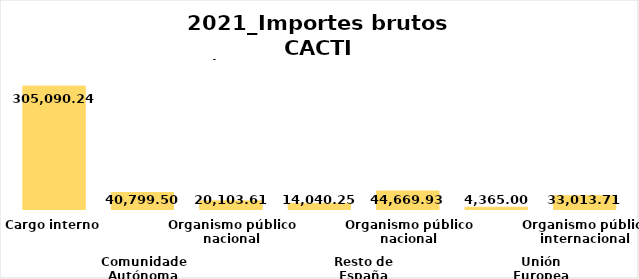
| Category | Series 0 |
|---|---|
| 0 | 305090.237 |
| 1 | 40799.504 |
| 2 | 20103.612 |
| 3 | 14040.254 |
| 4 | 44669.934 |
| 5 | 4365 |
| 6 | 33013.71 |